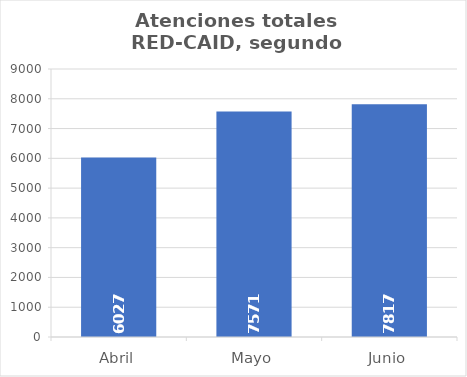
| Category | Series 0 |
|---|---|
| Abril | 6027 |
| Mayo | 7571 |
| Junio | 7817 |